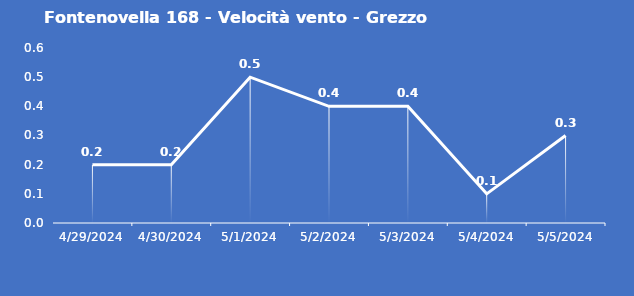
| Category | Fontenovella 168 - Velocità vento - Grezzo (m/s) |
|---|---|
| 4/29/24 | 0.2 |
| 4/30/24 | 0.2 |
| 5/1/24 | 0.5 |
| 5/2/24 | 0.4 |
| 5/3/24 | 0.4 |
| 5/4/24 | 0.1 |
| 5/5/24 | 0.3 |